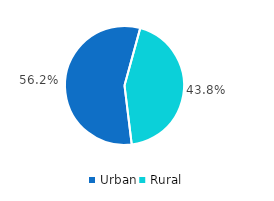
| Category | Series 0 |
|---|---|
| Urban | 56.2 |
| Rural | 43.8 |